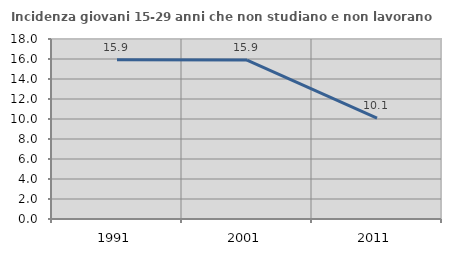
| Category | Incidenza giovani 15-29 anni che non studiano e non lavorano  |
|---|---|
| 1991.0 | 15.932 |
| 2001.0 | 15.891 |
| 2011.0 | 10.084 |